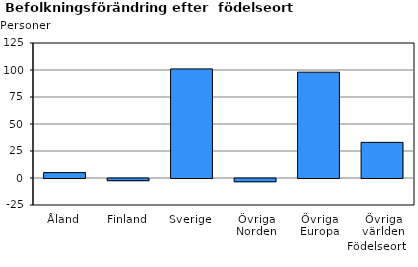
| Category | Series 0 |
|---|---|
| Åland | 5 |
| Finland | -2 |
| Sverige | 101 |
| Övriga Norden | -3 |
| Övriga Europa | 98 |
| Övriga världen | 33 |